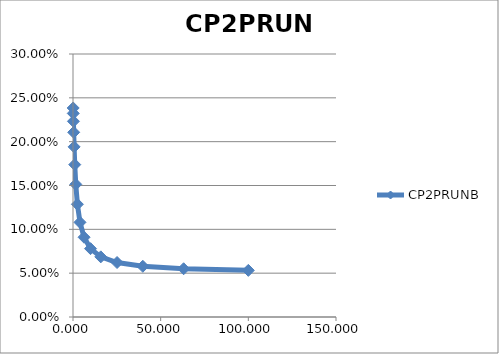
| Category | CP2PRUNB |
|---|---|
| 0.1 | 0.238 |
| 0.158489319246111 | 0.232 |
| 0.251188643150958 | 0.223 |
| 0.398107170553497 | 0.211 |
| 0.630957344480193 | 0.194 |
| 1.0 | 0.174 |
| 1.584893192461114 | 0.151 |
| 2.511886431509581 | 0.129 |
| 3.981071705534972 | 0.108 |
| 6.309573444801934 | 0.091 |
| 10.0 | 0.078 |
| 15.84893192461114 | 0.069 |
| 25.1188643150958 | 0.062 |
| 39.81071705534976 | 0.058 |
| 63.09573444801936 | 0.055 |
| 100.0 | 0.053 |